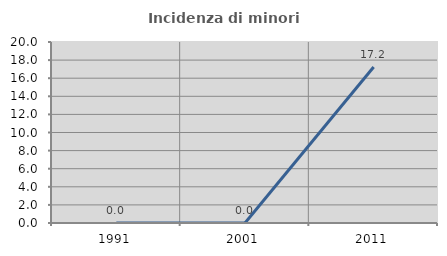
| Category | Incidenza di minori stranieri |
|---|---|
| 1991.0 | 0 |
| 2001.0 | 0 |
| 2011.0 | 17.241 |